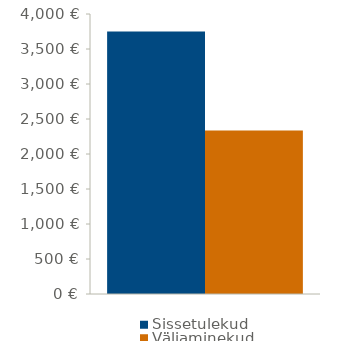
| Category | Sissetulekud | Väljaminekud |
|---|---|---|
| 0 | 3750 | 2336 |